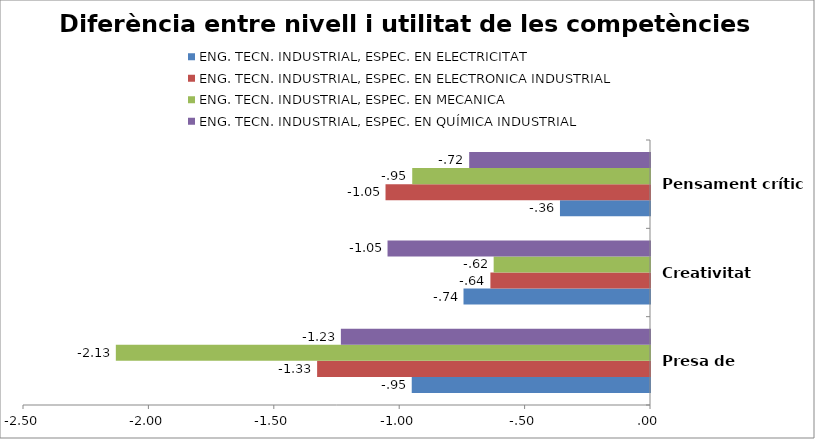
| Category | ENG. TECN. INDUSTRIAL, ESPEC. EN ELECTRICITAT | ENG. TECN. INDUSTRIAL, ESPEC. EN ELECTRONICA INDUSTRIAL | ENG. TECN. INDUSTRIAL, ESPEC. EN MECANICA | ENG. TECN. INDUSTRIAL, ESPEC. EN QUÍMICA INDUSTRIAL |
|---|---|---|---|---|
| Presa de decisions | -0.95 | -1.327 | -2.13 | -1.233 |
| Creativitat | -0.744 | -0.636 | -0.623 | -1.047 |
| Pensament crític | -0.359 | -1.055 | -0.948 | -0.721 |